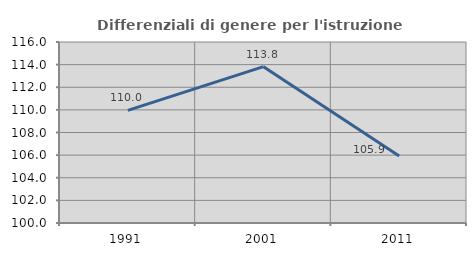
| Category | Differenziali di genere per l'istruzione superiore |
|---|---|
| 1991.0 | 109.957 |
| 2001.0 | 113.82 |
| 2011.0 | 105.923 |